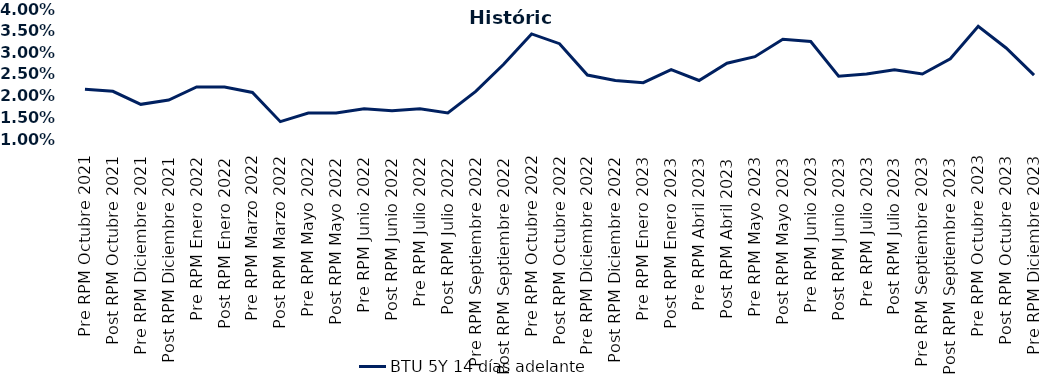
| Category | BTU 5Y 14 días adelante |
|---|---|
| Pre RPM Octubre 2021 | 0.022 |
| Post RPM Octubre 2021 | 0.021 |
| Pre RPM Diciembre 2021 | 0.018 |
| Post RPM Diciembre 2021 | 0.019 |
| Pre RPM Enero 2022 | 0.022 |
| Post RPM Enero 2022 | 0.022 |
| Pre RPM Marzo 2022 | 0.021 |
| Post RPM Marzo 2022 | 0.014 |
| Pre RPM Mayo 2022 | 0.016 |
| Post RPM Mayo 2022 | 0.016 |
| Pre RPM Junio 2022 | 0.017 |
| Post RPM Junio 2022 | 0.016 |
| Pre RPM Julio 2022 | 0.017 |
| Post RPM Julio 2022 | 0.016 |
| Pre RPM Septiembre 2022 | 0.021 |
| Post RPM Septiembre 2022 | 0.027 |
| Pre RPM Octubre 2022 | 0.034 |
| Post RPM Octubre 2022 | 0.032 |
| Pre RPM Diciembre 2022 | 0.025 |
| Post RPM Diciembre 2022 | 0.024 |
| Pre RPM Enero 2023 | 0.023 |
| Post RPM Enero 2023 | 0.026 |
| Pre RPM Abril 2023 | 0.024 |
| Post RPM Abril 2023 | 0.028 |
| Pre RPM Mayo 2023 | 0.029 |
| Post RPM Mayo 2023 | 0.033 |
| Pre RPM Junio 2023 | 0.032 |
| Post RPM Junio 2023 | 0.024 |
| Pre RPM Julio 2023 | 0.025 |
| Post RPM Julio 2023 | 0.026 |
| Pre RPM Septiembre 2023 | 0.025 |
| Post RPM Septiembre 2023 | 0.028 |
| Pre RPM Octubre 2023 | 0.036 |
| Post RPM Octubre 2023 | 0.031 |
| Pre RPM Diciembre 2023 | 0.025 |